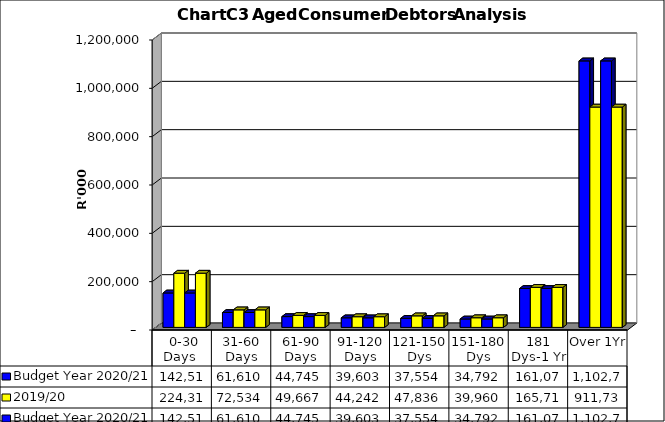
| Category | Budget Year 2020/21 | 2019/20 |
|---|---|---|
|  0-30 Days  | 142510370 | 224313369 |
| 31-60 Days | 61610229 | 72533590 |
| 61-90 Days | 44745246 | 49667034 |
| 91-120 Days | 39602645 | 44241546 |
| 121-150 Dys | 37553866 | 47836107 |
| 151-180 Dys | 34792487 | 39960226 |
| 181 Dys-1 Yr | 161075370 | 165710136 |
| Over 1Yr | 1102700728 | 911733168 |